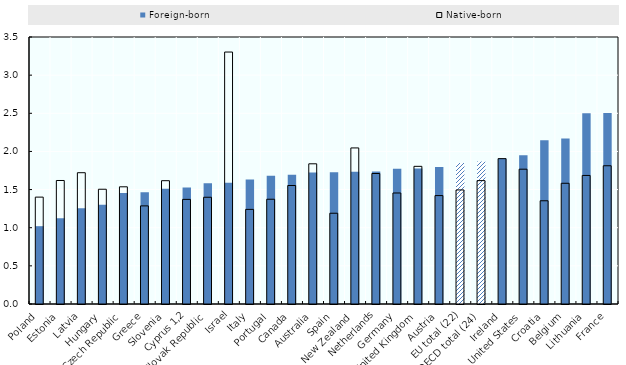
| Category | Foreign-born | Native-born |
|---|---|---|
| Poland | 1.02 | 1.401 |
| Estonia | 1.125 | 1.619 |
| Latvia | 1.255 | 1.721 |
| Hungary | 1.3 | 1.504 |
| Czech Republic | 1.455 | 1.536 |
| Greece | 1.465 | 1.286 |
| Slovenia | 1.509 | 1.616 |
| Cyprus 1,2 | 1.527 | 1.371 |
| Slovak Republic | 1.584 | 1.399 |
| Israel | 1.589 | 3.303 |
| Italy | 1.632 | 1.24 |
| Portugal | 1.683 | 1.373 |
| Canada | 1.695 | 1.553 |
| Australia | 1.725 | 1.838 |
| Spain | 1.727 | 1.19 |
| New Zealand | 1.733 | 2.046 |
| Netherlands | 1.737 | 1.711 |
| Germany | 1.774 | 1.455 |
| United Kingdom | 1.776 | 1.805 |
| Austria | 1.795 | 1.421 |
| EU total (22) | 1.849 | 1.495 |
| OECD total (24) | 1.867 | 1.617 |
| Ireland | 1.906 | 1.905 |
| United States | 1.95 | 1.767 |
| Croatia | 2.146 | 1.353 |
| Belgium | 2.171 | 1.583 |
| Lithuania | 2.499 | 1.685 |
| France | 2.503 | 1.812 |